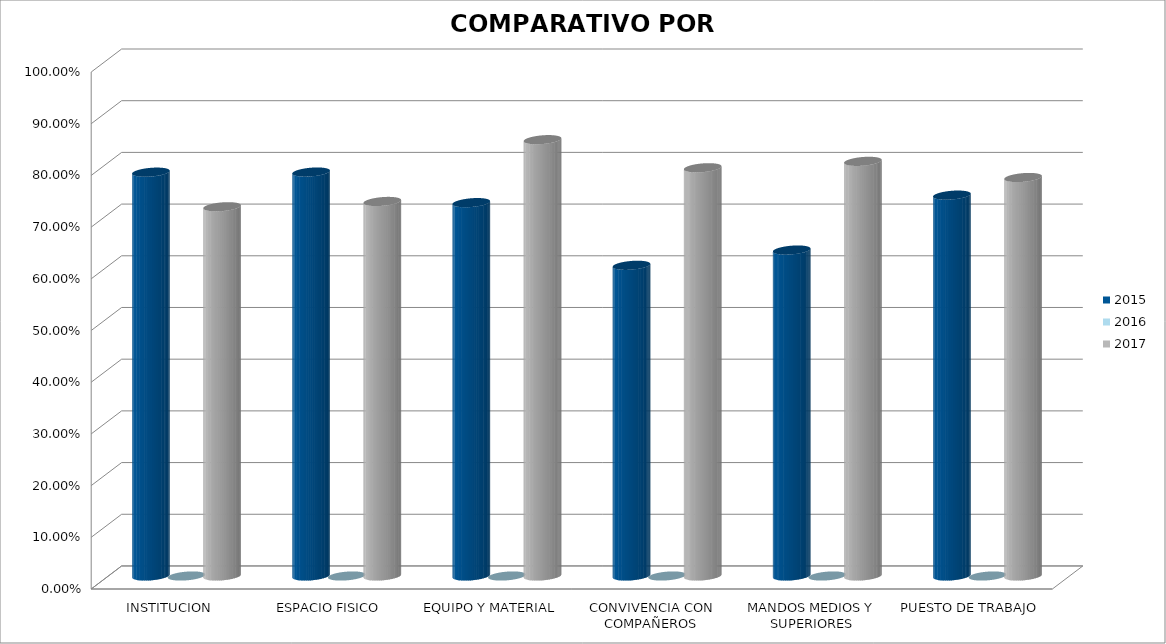
| Category | 2015 | 2016 | 2017 |
|---|---|---|---|
| INSTITUCION | 0.781 | 0 | 0.714 |
| ESPACIO FISICO | 0.781 | 0 | 0.724 |
| EQUIPO Y MATERIAL | 0.722 | 0 | 0.844 |
| CONVIVENCIA CON COMPAÑEROS | 0.601 | 0 | 0.79 |
| MANDOS MEDIOS Y SUPERIORES | 0.631 | 0 | 0.802 |
| PUESTO DE TRABAJO | 0.737 | 0 | 0.771 |